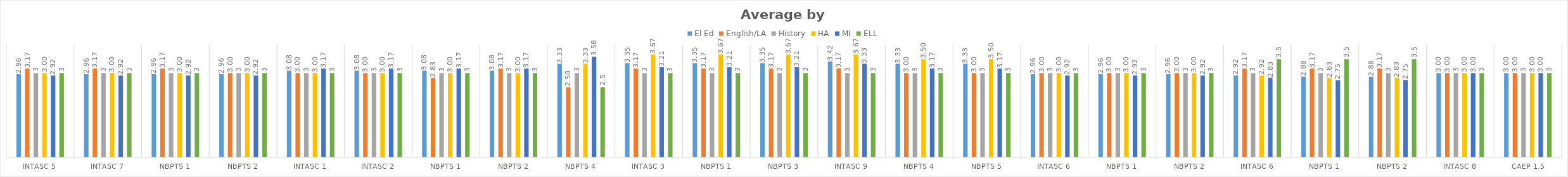
| Category | El Ed | English/LA | History | HA | MI | ELL |
|---|---|---|---|---|---|---|
| InTASC 5 | 2.958 | 3.167 | 3 | 3 | 2.917 | 3 |
| InTASC 7 | 2.958 | 3.167 | 3 | 3 | 2.917 | 3 |
| NBPTS 1 | 2.958 | 3.167 | 3 | 3 | 2.917 | 3 |
| NBPTS 2 | 2.958 | 3 | 3 | 3 | 2.917 | 3 |
| InTASC 1 | 3.083 | 3 | 3 | 3 | 3.167 | 3 |
| InTASC 2 | 3.083 | 3 | 3 | 3 | 3.167 | 3 |
| NBPTS 1 | 3.083 | 2.833 | 3 | 3 | 3.167 | 3 |
| NBPTS 2 | 3.083 | 3.167 | 3 | 3 | 3.167 | 3 |
| NBPTS 4 | 3.333 | 2.5 | 3 | 3.333 | 3.583 | 2.5 |
| InTASC 3 | 3.354 | 3.167 | 3 | 3.667 | 3.208 | 3 |
| NBPTS 1 | 3.354 | 3.167 | 3 | 3.667 | 3.208 | 3 |
| NBPTS 3 | 3.354 | 3.167 | 3 | 3.667 | 3.208 | 3 |
| InTASC 9 | 3.417 | 3.167 | 3 | 3.667 | 3.333 | 3 |
| NBPTS 4 | 3.333 | 3 | 3 | 3.5 | 3.167 | 3 |
| NBPTS 5 | 3.333 | 3 | 3 | 3.5 | 3.167 | 3 |
| InTASC 6 | 2.958 | 3 | 3 | 3 | 2.917 | 3 |
| NBPTS 1 | 2.958 | 3 | 3 | 3 | 2.917 | 3 |
| NBPTS 2 | 2.958 | 3 | 3 | 3 | 2.917 | 3 |
| InTASC 6 | 2.917 | 3.167 | 3 | 2.917 | 2.833 | 3.5 |
| NBPTS 1 | 2.875 | 3.167 | 3 | 2.833 | 2.75 | 3.5 |
| NBPTS 2 | 2.875 | 3.167 | 3 | 2.833 | 2.75 | 3.5 |
| InTASC 8 | 3 | 3 | 3 | 3 | 3 | 3 |
| CAEP 1.5 | 3 | 3 | 3 | 3 | 3 | 3 |